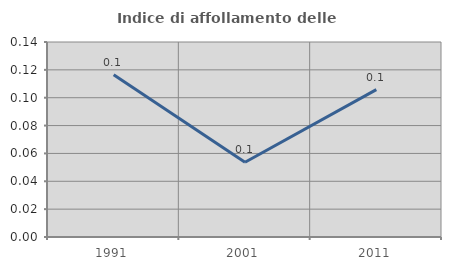
| Category | Indice di affollamento delle abitazioni  |
|---|---|
| 1991.0 | 0.116 |
| 2001.0 | 0.054 |
| 2011.0 | 0.106 |